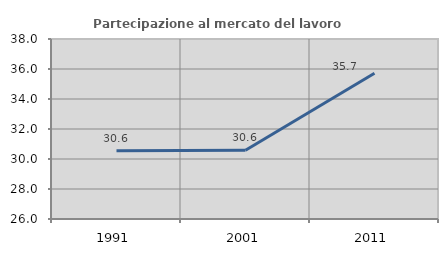
| Category | Partecipazione al mercato del lavoro  femminile |
|---|---|
| 1991.0 | 30.555 |
| 2001.0 | 30.586 |
| 2011.0 | 35.716 |